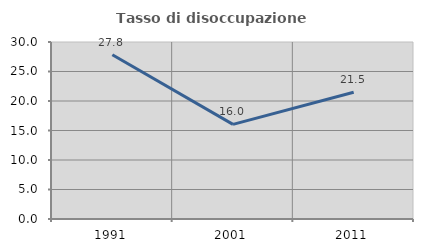
| Category | Tasso di disoccupazione giovanile  |
|---|---|
| 1991.0 | 27.842 |
| 2001.0 | 16.038 |
| 2011.0 | 21.488 |